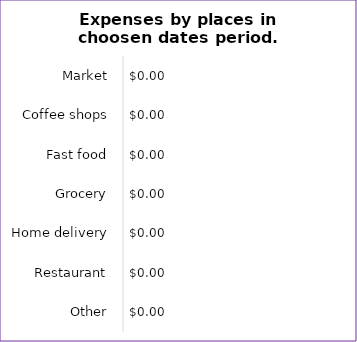
| Category | Expenses |
|---|---|
| Market | 0 |
| Coffee shops | 0 |
| Fast food | 0 |
| Grocery | 0 |
| Home delivery | 0 |
| Restaurant | 0 |
| Other | 0 |